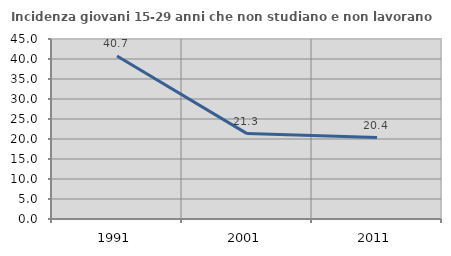
| Category | Incidenza giovani 15-29 anni che non studiano e non lavorano  |
|---|---|
| 1991.0 | 40.748 |
| 2001.0 | 21.348 |
| 2011.0 | 20.37 |